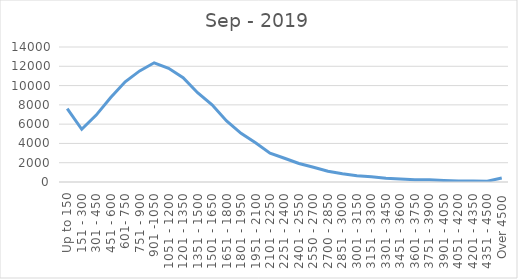
| Category | Sep - 2019 |
|---|---|
| Up to 150 | 7612 |
| 151 - 300 | 5468 |
| 301 - 450 | 6939 |
| 451 - 600 | 8758 |
| 601- 750 | 10393 |
| 751 - 900 | 11522 |
| 901 -1050 | 12361 |
| 1051 - 1200 | 11789 |
| 1201 - 1350 | 10815 |
| 1351 - 1500 | 9263 |
| 1501 - 1650 | 8001 |
| 1651 - 1800 | 6338 |
| 1801 - 1950 | 5045 |
| 1951 - 2100 | 4062 |
| 2101 - 2250 | 2994 |
| 2251 - 2400 | 2460 |
| 2401 - 2550 | 1917 |
| 2550 - 2700 | 1527 |
| 2700 - 2850 | 1112 |
| 2851 - 3000 | 858 |
| 3001 - 3150 | 645 |
| 3151 - 3300 | 555 |
| 3301 - 3450 | 381 |
| 3451 - 3600 | 301 |
| 3601 - 3750 | 233 |
| 3751 - 3900 | 223 |
| 3901 - 4050 | 164 |
| 4051 - 4200 | 116 |
| 4201 - 4350 | 98 |
| 4351 - 4500 | 78 |
| Over 4500 | 413 |